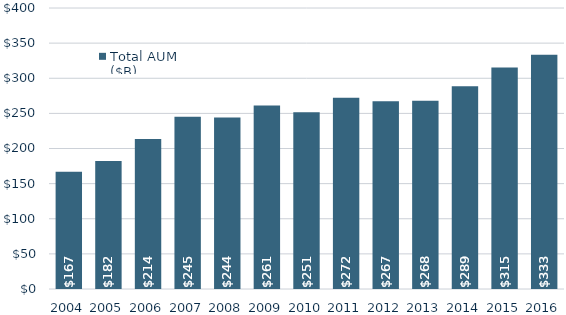
| Category | Total AUM ($B) |
|---|---|
| 2004.0 | 166.946 |
| 2005.0 | 182.223 |
| 2006.0 | 213.696 |
| 2007.0 | 245.244 |
| 2008.0 | 244.018 |
| 2009.0 | 261.352 |
| 2010.0 | 251.461 |
| 2011.0 | 272.271 |
| 2012.0 | 267.147 |
| 2013.0 | 267.898 |
| 2014.0 | 288.529 |
| 2015.0 | 315.198 |
| 2016.0 | 333.49 |